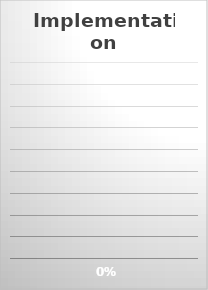
| Category | Series 0 |
|---|---|
| All Controls Implemented: | 0 |